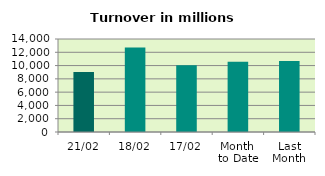
| Category | Series 0 |
|---|---|
| 21/02 | 9027.64 |
| 18/02 | 12709.917 |
| 17/02 | 10043.408 |
| Month 
to Date | 10568.339 |
| Last
Month | 10672.471 |